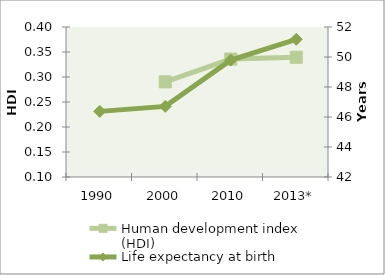
| Category | Human development index (HDI) |
|---|---|
| 1990 | 0 |
| 2000 | 0.29 |
| 2010 | 0.336 |
| 2013* | 0.34 |